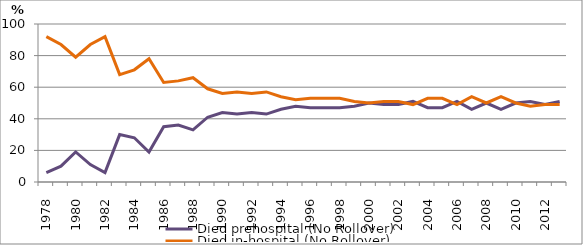
| Category | Died prehospital (No Rollover) | Died in-hospital (No Rollover) |
|---|---|---|
| 1978.0 | 6 | 92 |
| 1979.0 | 10 | 87 |
| 1980.0 | 19 | 79 |
| 1981.0 | 11 | 87 |
| 1982.0 | 6 | 92 |
| 1983.0 | 30 | 68 |
| 1984.0 | 28 | 71 |
| 1985.0 | 19 | 78 |
| 1986.0 | 35 | 63 |
| 1987.0 | 36 | 64 |
| 1988.0 | 33 | 66 |
| 1989.0 | 41 | 59 |
| 1990.0 | 44 | 56 |
| 1991.0 | 43 | 57 |
| 1992.0 | 44 | 56 |
| 1993.0 | 43 | 57 |
| 1994.0 | 46 | 54 |
| 1995.0 | 48 | 52 |
| 1996.0 | 47 | 53 |
| 1997.0 | 47 | 53 |
| 1998.0 | 47 | 53 |
| 1999.0 | 48 | 51 |
| 2000.0 | 50 | 50 |
| 2001.0 | 49 | 51 |
| 2002.0 | 49 | 51 |
| 2003.0 | 51 | 49 |
| 2004.0 | 47 | 53 |
| 2005.0 | 47 | 53 |
| 2006.0 | 51 | 49 |
| 2007.0 | 46 | 54 |
| 2008.0 | 50 | 50 |
| 2009.0 | 46 | 54 |
| 2010.0 | 50 | 50 |
| 2011.0 | 51 | 48 |
| 2012.0 | 49 | 49 |
| 2013.0 | 51 | 49 |